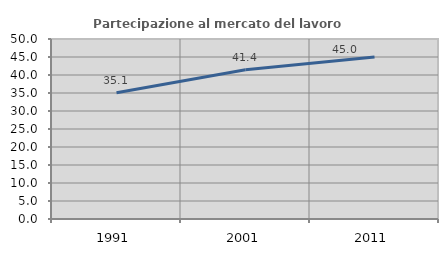
| Category | Partecipazione al mercato del lavoro  femminile |
|---|---|
| 1991.0 | 35.083 |
| 2001.0 | 41.441 |
| 2011.0 | 45.013 |